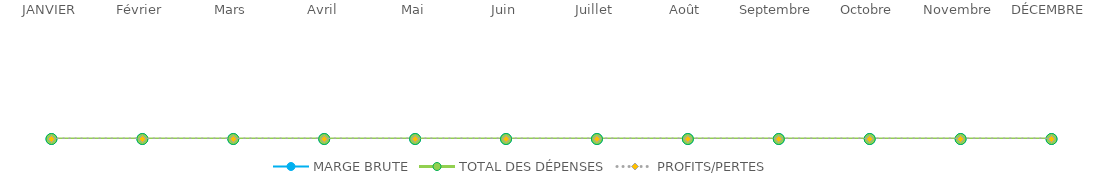
| Category | MARGE BRUTE | TOTAL DES DÉPENSES | PROFITS/PERTES |
|---|---|---|---|
| JANVIER | 0 | 0 | 0 |
| Février | 0 | 0 | 0 |
| Mars | 0 | 0 | 0 |
| Avril | 0 | 0 | 0 |
| Mai | 0 | 0 | 0 |
| Juin | 0 | 0 | 0 |
| Juillet | 0 | 0 | 0 |
| Août | 0 | 0 | 0 |
| Septembre | 0 | 0 | 0 |
| Octobre | 0 | 0 | 0 |
| Novembre | 0 | 0 | 0 |
| DÉCEMBRE | 0 | 0 | 0 |